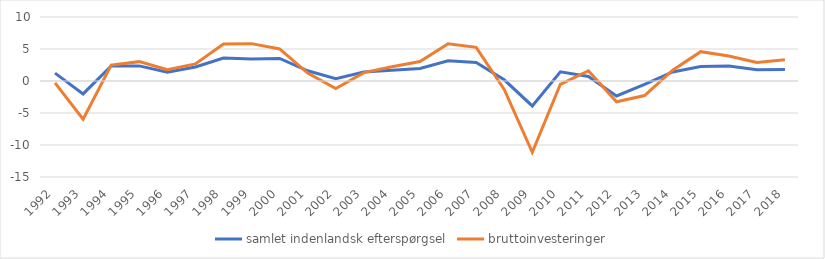
| Category | samlet indenlandsk efterspørgsel | bruttoinvesteringer |
|---|---|---|
| 1992 | 1.228 | -0.286 |
| 1993 | -2.021 | -5.982 |
| 1994 | 2.336 | 2.483 |
| 1995 | 2.36 | 3.025 |
| 1996 | 1.383 | 1.761 |
| 1997 | 2.185 | 2.661 |
| 1998 | 3.6 | 5.772 |
| 1999 | 3.456 | 5.837 |
| 2000 | 3.523 | 5.004 |
| 2001 | 1.596 | 1.243 |
| 2002 | 0.368 | -1.172 |
| 2003 | 1.394 | 1.307 |
| 2004 | 1.685 | 2.216 |
| 2005 | 1.95 | 3.04 |
| 2006 | 3.152 | 5.809 |
| 2007 | 2.906 | 5.258 |
| 2008 | 0.19 | -1.329 |
| 2009 | -3.9 | -11.133 |
| 2010 | 1.435 | -0.515 |
| 2011 | 0.714 | 1.6 |
| 2012 | -2.346 | -3.248 |
| 2013 | -0.537 | -2.272 |
| 2014 | 1.414 | 1.696 |
| 2015 | 2.251 | 4.585 |
| 2016 | 2.356 | 3.917 |
| 2017 | 1.766 | 2.906 |
| 2018 | 1.801 | 3.333 |